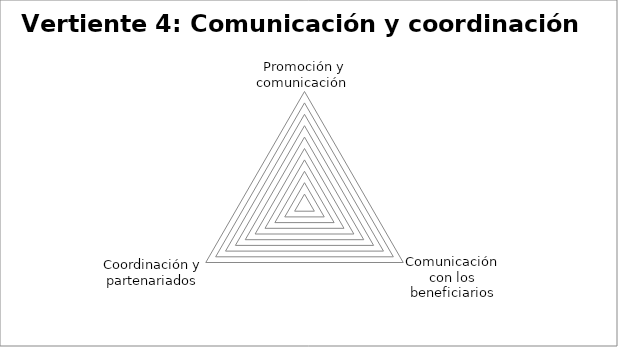
| Category | Series 0 |
|---|---|
| Promoción y comunicación  | 0 |
| Comunicación con los beneficiarios | 0 |
| Coordinación y partenariados | 0 |